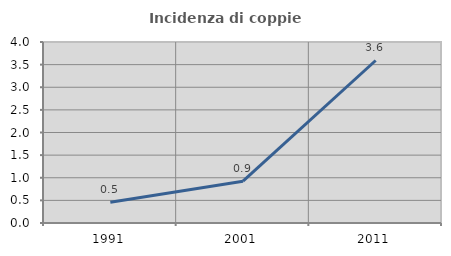
| Category | Incidenza di coppie miste |
|---|---|
| 1991.0 | 0.457 |
| 2001.0 | 0.925 |
| 2011.0 | 3.591 |